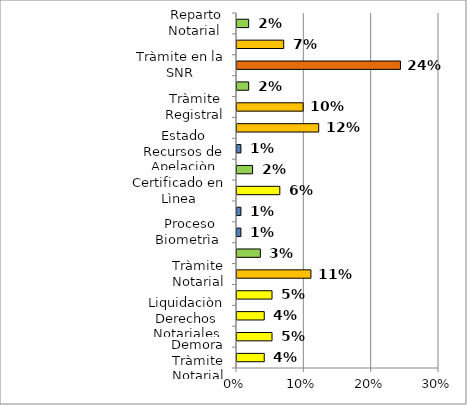
| Category | Series 0 |
|---|---|
| Demora Tràmite Notarial | 0.04 |
| Informaciòn General | 0.052 |
| Liquidaciòn Derechos Notariales | 0.04 |
| Mala prestaciòn del servicio Notarial | 0.052 |
| Tràmite Notarial | 0.11 |
| Estado Radicado | 0.035 |
| Proceso Biometrìa  | 0.006 |
| Actualizaciòn | 0.006 |
| Certificado en Lìnea | 0.064 |
| Demora Tràmite Registral | 0.023 |
| Estado Recursos de Apelaciòn | 0.006 |
| Notificaciòn | 0.121 |
| Tràmite Registral | 0.098 |
| Mala prestaciòn del Servicio Registral | 0.017 |
| Tràmite en la SNR | 0.243 |
| Consulta Jurìdica | 0.069 |
| Reparto Notarial  | 0.017 |